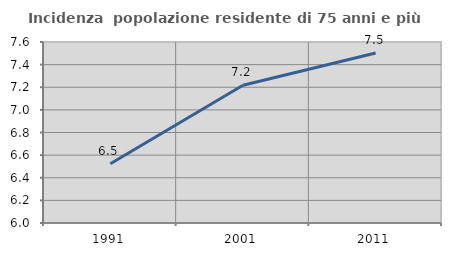
| Category | Incidenza  popolazione residente di 75 anni e più |
|---|---|
| 1991.0 | 6.524 |
| 2001.0 | 7.218 |
| 2011.0 | 7.503 |